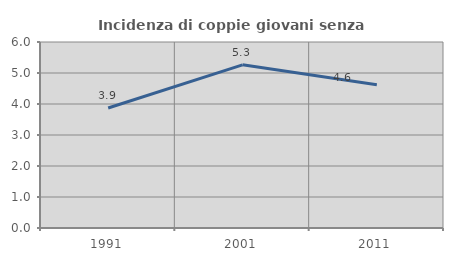
| Category | Incidenza di coppie giovani senza figli |
|---|---|
| 1991.0 | 3.87 |
| 2001.0 | 5.263 |
| 2011.0 | 4.621 |